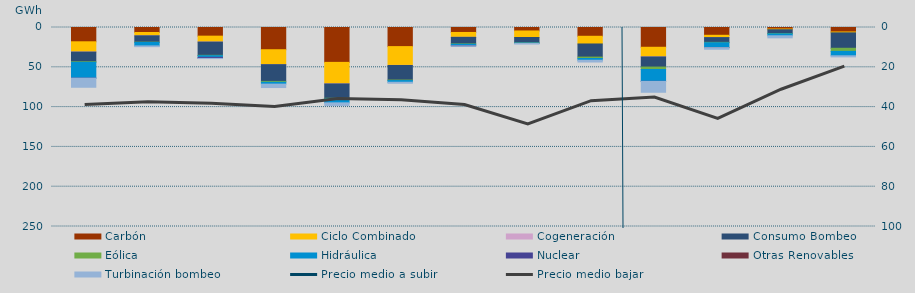
| Category | Carbón | Ciclo Combinado | Cogeneración | Consumo Bombeo | Eólica | Hidráulica | Nuclear | Otras Renovables | Turbinación bombeo |
|---|---|---|---|---|---|---|---|---|---|
| 0 | 17956.2 | 12815.5 | 103.4 | 12162.2 | 688.3 | 19850.2 | 66 | 0 | 11430.1 |
| 1 | 6283.8 | 4145.3 | 18.9 | 7977.8 | 313 | 4389.8 | 0 | 0 | 935.6 |
| 2 | 10864.5 | 7378.2 | 88.1 | 16621.4 | 464.4 | 2067.3 | 1381.8 | 0 | 160.4 |
| 3 | 27924.7 | 18737.8 | 26.5 | 21039.7 | 1083.3 | 2318.1 | 0 | 0 | 4314 |
| 4 | 43819.1 | 26947.4 | 131.4 | 18038.2 | 700.3 | 5037 | 0 | 0 | 3400 |
| 5 | 23995.8 | 23603.4 | 120.4 | 18312.9 | 630.7 | 2095.3 | 0 | 0 | 1288.4 |
| 6 | 6238.1 | 6107.2 | 11.4 | 8233.1 | 466.1 | 1774.5 | 300.5 | 0 | 185 |
| 7 | 4345.4 | 8205.3 | 0 | 6736.7 | 204.5 | 506 | 0 | 0 | 802.1 |
| 8 | 11031.5 | 9660.7 | 0 | 16502.5 | 1775.9 | 2151.2 | 0 | 0 | 2234.6 |
| 9 | 24843.5 | 12025 | 139.2 | 12696.1 | 3036.8 | 14862.1 | 109.8 | 0 | 13649 |
| 10 | 9788.3 | 2896.9 | 13 | 5978.6 | 470.2 | 6144.5 | 0 | 2 | 2006.5 |
| 11 | 1915.7 | 883.7 | 0 | 4789.3 | 395.2 | 2417.8 | 0 | 0 | 2598.3 |
| 12 | 5601.6 | 1130.8 | 0 | 19369.2 | 3910.4 | 5534.9 | 0 | 0 | 1362.4 |